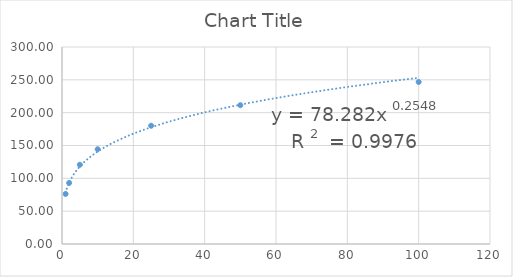
| Category | Series 0 |
|---|---|
| 1.0 | 76.218 |
| 2.0 | 92.986 |
| 5.0 | 120.678 |
| 10.0 | 144.306 |
| 25.0 | 180.129 |
| 50.0 | 211.378 |
| 100.0 | 246.692 |